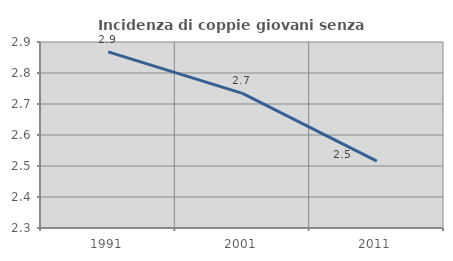
| Category | Incidenza di coppie giovani senza figli |
|---|---|
| 1991.0 | 2.868 |
| 2001.0 | 2.734 |
| 2011.0 | 2.516 |